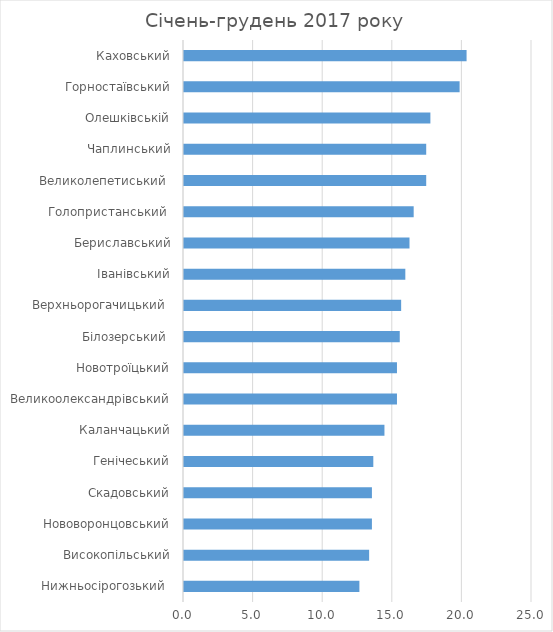
| Category | Series 0 |
|---|---|
| Нижньосірогозький  | 12.6 |
| Високопільський | 13.3 |
| Нововоронцовський | 13.5 |
| Скадовський | 13.5 |
| Генічеський | 13.6 |
| Каланчацький | 14.4 |
| Великоолександрівський | 15.3 |
| Новотроїцький | 15.3 |
| Білозерський  | 15.5 |
| Верхньорогачицький  | 15.6 |
| Іванівський | 15.9 |
| Бериславський | 16.2 |
| Голопристанський  | 16.5 |
| Великолепетиський  | 17.4 |
| Чаплинський | 17.4 |
| Олешківській | 17.7 |
| Горностаївський | 19.8 |
| Каховський | 20.3 |